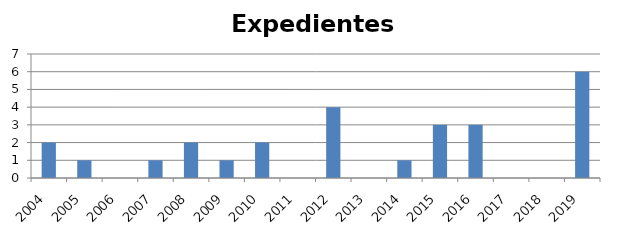
| Category | Expedientes Disciplinarios |
|---|---|
| 2004.0 | 2 |
| 2005.0 | 1 |
| 2006.0 | 0 |
| 2007.0 | 1 |
| 2008.0 | 2 |
| 2009.0 | 1 |
| 2010.0 | 2 |
| 2011.0 | 0 |
| 2012.0 | 4 |
| 2013.0 | 0 |
| 2014.0 | 1 |
| 2015.0 | 3 |
| 2016.0 | 3 |
| 2017.0 | 0 |
| 2018.0 | 0 |
| 2019.0 | 6 |